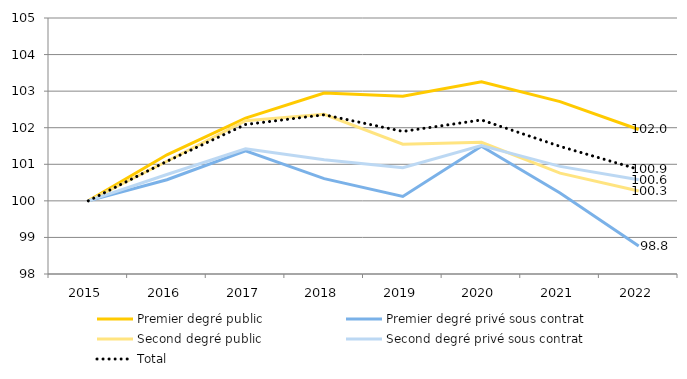
| Category | Premier degré public | Premier degré privé sous contrat | Second degré public | Second degré privé sous contrat | Total |
|---|---|---|---|---|---|
| 2015.0 | 100 | 100 | 100 | 100 | 100 |
| 2016.0 | 101.26 | 100.577 | 101.082 | 100.721 | 101.082 |
| 2017.0 | 102.262 | 101.369 | 102.192 | 101.425 | 102.088 |
| 2018.0 | 102.947 | 100.608 | 102.366 | 101.126 | 102.353 |
| 2019.0 | 102.862 | 100.121 | 101.55 | 100.904 | 101.898 |
| 2020.0 | 103.259 | 101.494 | 101.6 | 101.514 | 102.212 |
| 2021.0 | 102.712 | 100.218 | 100.757 | 100.942 | 101.49 |
| 2022.0 | 101.951 | 98.768 | 100.267 | 100.575 | 100.86 |